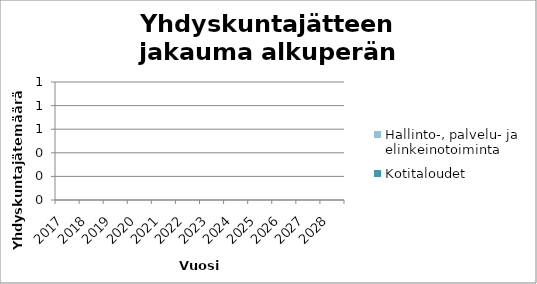
| Category | Kotitaloudet | Hallinto-, palvelu- ja elinkeinotoiminta |
|---|---|---|
| 2017.0 | 0 | 0 |
| 2018.0 | 0 | 0 |
| 2019.0 | 0 | 0 |
| 2020.0 | 0 | 0 |
| 2021.0 | 0 | 0 |
| 2022.0 | 0 | 0 |
| 2023.0 | 0 | 0 |
| 2024.0 | 0 | 0 |
| 2025.0 | 0 | 0 |
| 2026.0 | 0 | 0 |
| 2027.0 | 0 | 0 |
| 2028.0 | 0 | 0 |